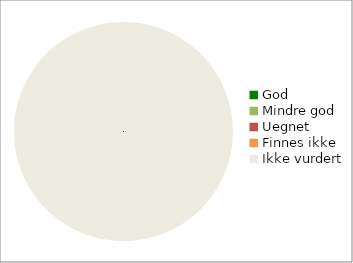
| Category | Series 0 |
|---|---|
| God | 0 |
| Mindre god | 0 |
| Uegnet | 0 |
| Finnes ikke | 0 |
| Ikke vurdert | 151 |